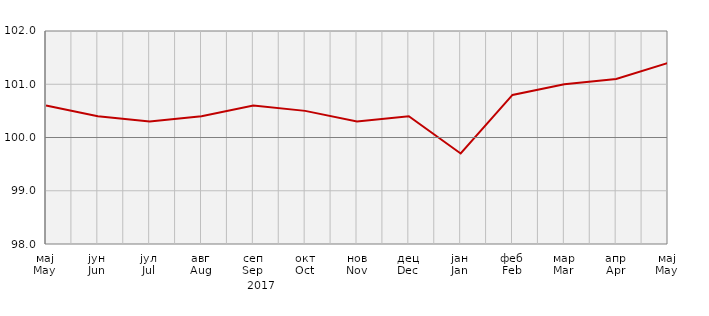
| Category | Индекси потрошачких цијена
Consumer price indices |
|---|---|
| мај
May | 100.6 |
| јун
Jun | 100.4 |
| јул
Jul | 100.3 |
| авг
Aug | 100.4 |
| сеп
Sep | 100.6 |
| окт
Oct | 100.5 |
| нов
Nov | 100.3 |
| дец
Dec | 100.4 |
| јан
Jan | 99.7 |
| феб
Feb | 100.8 |
| мар
Mar | 101 |
| апр
Apr | 101.1 |
| мај
May | 101.4 |